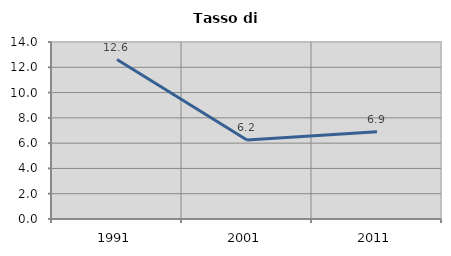
| Category | Tasso di disoccupazione   |
|---|---|
| 1991.0 | 12.614 |
| 2001.0 | 6.242 |
| 2011.0 | 6.908 |